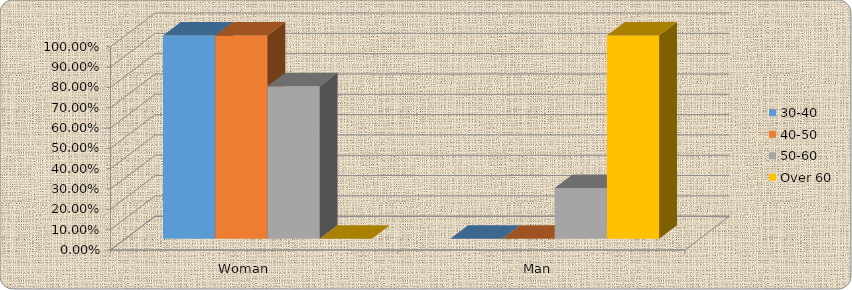
| Category | 30-40 | 40-50 | 50-60 | Over 60 |
|---|---|---|---|---|
| Woman     | 1 | 1 | 0.75 | 0 |
| Man  | 0 | 0 | 0.25 | 1 |